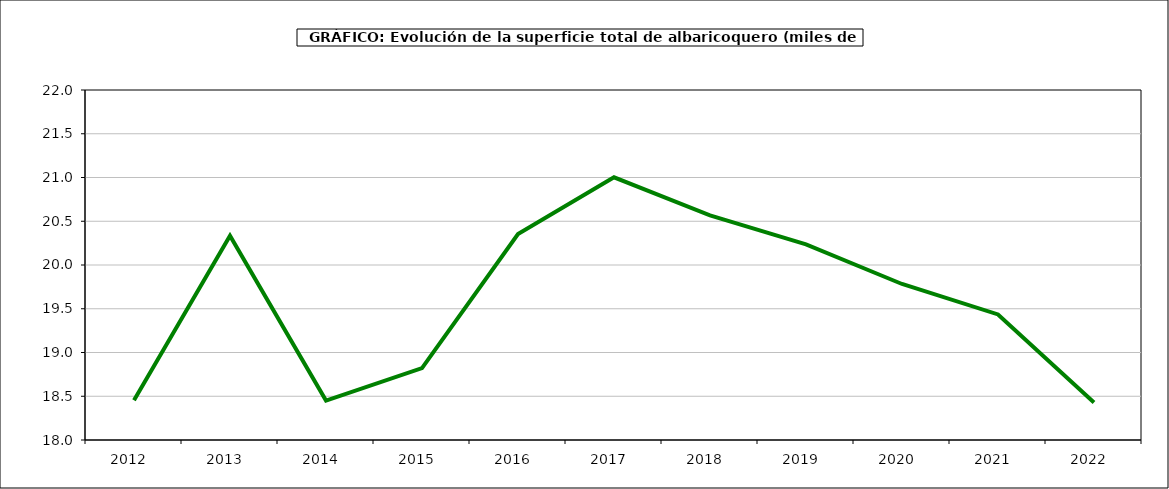
| Category | superficie albaricoquero |
|---|---|
| 2012.0 | 18.455 |
| 2013.0 | 20.334 |
| 2014.0 | 18.451 |
| 2015.0 | 18.822 |
| 2016.0 | 20.353 |
| 2017.0 | 21.002 |
| 2018.0 | 20.567 |
| 2019.0 | 20.235 |
| 2020.0 | 19.783 |
| 2021.0 | 19.435 |
| 2022.0 | 18.428 |